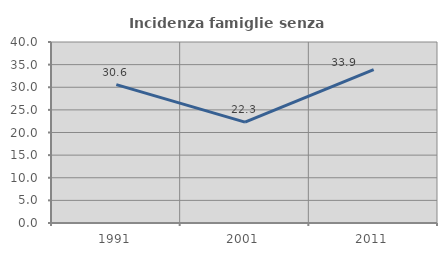
| Category | Incidenza famiglie senza nuclei |
|---|---|
| 1991.0 | 30.586 |
| 2001.0 | 22.3 |
| 2011.0 | 33.887 |